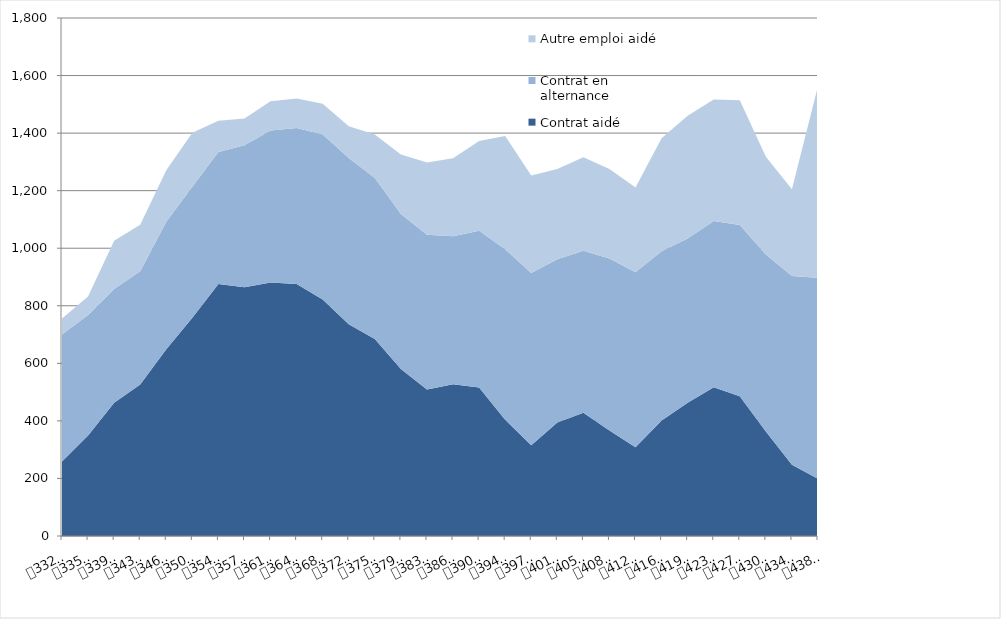
| Category | Contrat aidé | Contrat en alternance | Autre emploi aidé |
|---|---|---|---|
| 0 | 258.704 | 441.389 | 55.908 |
| 1 | 348.843 | 419.167 | 64.155 |
| 2 | 463.022 | 394.996 | 168.224 |
| 3 | 526.502 | 393.61 | 161.12 |
| 4 | 648.667 | 443.071 | 179.133 |
| 5 | 758.258 | 455.093 | 188.268 |
| 6 | 876.04 | 458.435 | 108.187 |
| 7 | 864.678 | 492.965 | 93.195 |
| 8 | 881.026 | 527.898 | 101.659 |
| 9 | 875.337 | 542.371 | 102.595 |
| 10 | 821.42 | 574.038 | 106.153 |
| 11 | 735.557 | 577.753 | 110.78 |
| 12 | 684.159 | 559.448 | 151.634 |
| 13 | 579.882 | 538.75 | 206.978 |
| 14 | 508.971 | 538.088 | 250.776 |
| 15 | 526.936 | 514.355 | 271.425 |
| 16 | 516.025 | 544.919 | 311.281 |
| 17 | 403.936 | 592.617 | 393.575 |
| 18 | 315.015 | 598.627 | 339.396 |
| 19 | 394.009 | 567.553 | 313.667 |
| 20 | 428.303 | 562.757 | 325.11 |
| 21 | 366.809 | 597.41 | 311.075 |
| 22 | 308.649 | 607.802 | 294.463 |
| 23 | 401.252 | 588.583 | 392.486 |
| 24 | 463.069 | 570.938 | 426.73 |
| 25 | 516.804 | 577.707 | 422.231 |
| 26 | 485.79 | 595.325 | 433.176 |
| 27 | 363.265 | 615.196 | 338.99 |
| 28 | 247.196 | 656.295 | 301.594 |
| 29 | 199 | 698 | 667 |